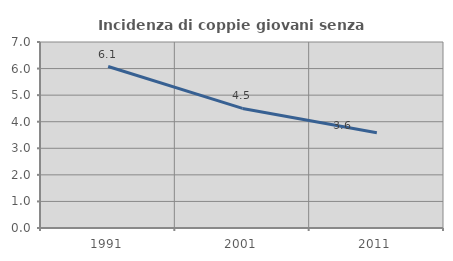
| Category | Incidenza di coppie giovani senza figli |
|---|---|
| 1991.0 | 6.077 |
| 2001.0 | 4.5 |
| 2011.0 | 3.587 |